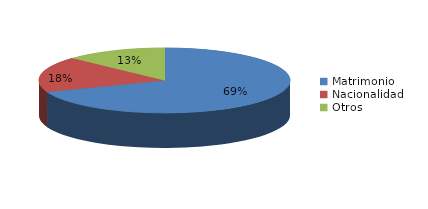
| Category | Series 0 |
|---|---|
| Matrimonio | 397 |
| Nacionalidad | 102 |
| Otros | 75 |